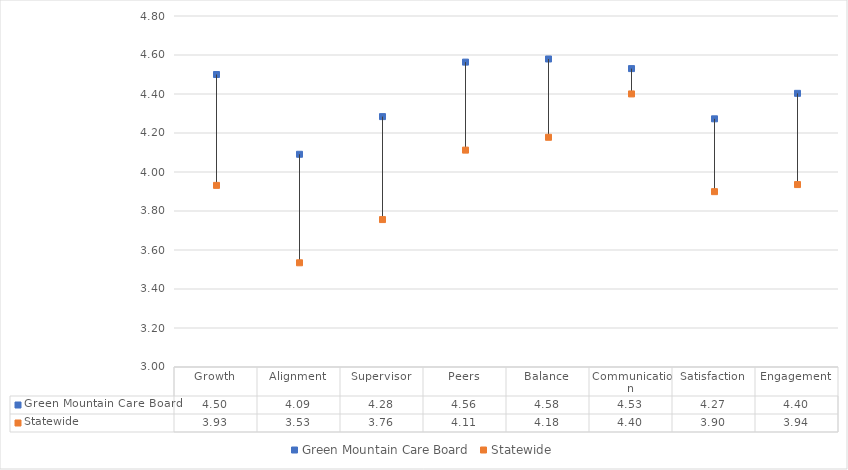
| Category | Green Mountain Care Board | Statewide |
|---|---|---|
| Growth | 4.5 | 3.931 |
| Alignment | 4.091 | 3.534 |
| Supervisor | 4.284 | 3.756 |
| Peers | 4.563 | 4.112 |
| Balance | 4.58 | 4.178 |
| Communication | 4.53 | 4.4 |
| Satisfaction | 4.273 | 3.899 |
| Engagement | 4.403 | 3.936 |